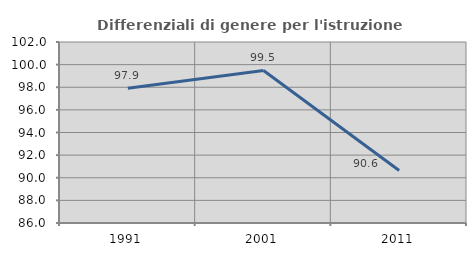
| Category | Differenziali di genere per l'istruzione superiore |
|---|---|
| 1991.0 | 97.907 |
| 2001.0 | 99.483 |
| 2011.0 | 90.643 |